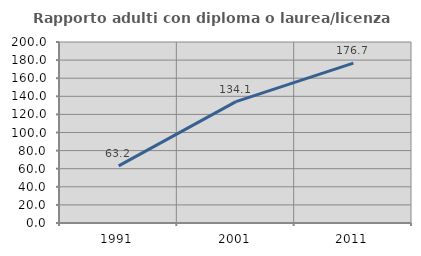
| Category | Rapporto adulti con diploma o laurea/licenza media  |
|---|---|
| 1991.0 | 63.158 |
| 2001.0 | 134.127 |
| 2011.0 | 176.726 |